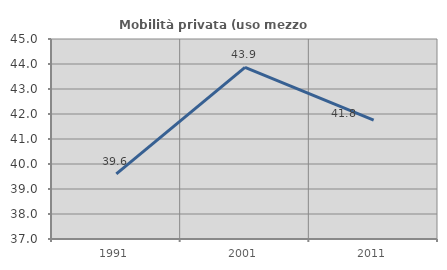
| Category | Mobilità privata (uso mezzo privato) |
|---|---|
| 1991.0 | 39.605 |
| 2001.0 | 43.869 |
| 2011.0 | 41.754 |